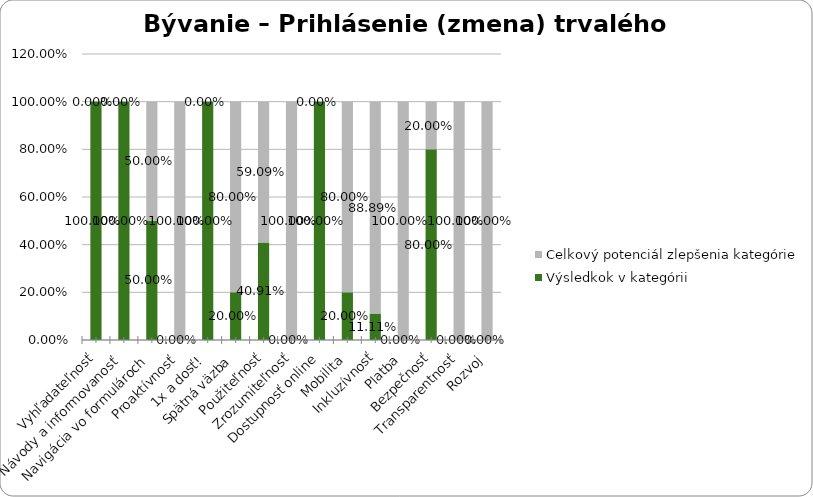
| Category | Výsledkok v kategórii | Celkový potenciál zlepšenia kategórie |
|---|---|---|
| Vyhľadateľnosť | 1 | 0 |
| Návody a informovanosť | 1 | 0 |
| Navigácia vo formulároch | 0.5 | 0.5 |
| Proaktívnosť | 0 | 1 |
| 1x a dosť! | 1 | 0 |
| Spätná väzba | 0.2 | 0.8 |
| Použiteľnosť | 0.409 | 0.591 |
| Zrozumiteľnosť | 0 | 1 |
| Dostupnosť online | 1 | 0 |
| Mobilita | 0.2 | 0.8 |
| Inkluzívnosť | 0.111 | 0.889 |
| Platba | 0 | 1 |
| Bezpečnosť | 0.8 | 0.2 |
| Transparentnosť | 0 | 1 |
| Rozvoj | 0 | 1 |